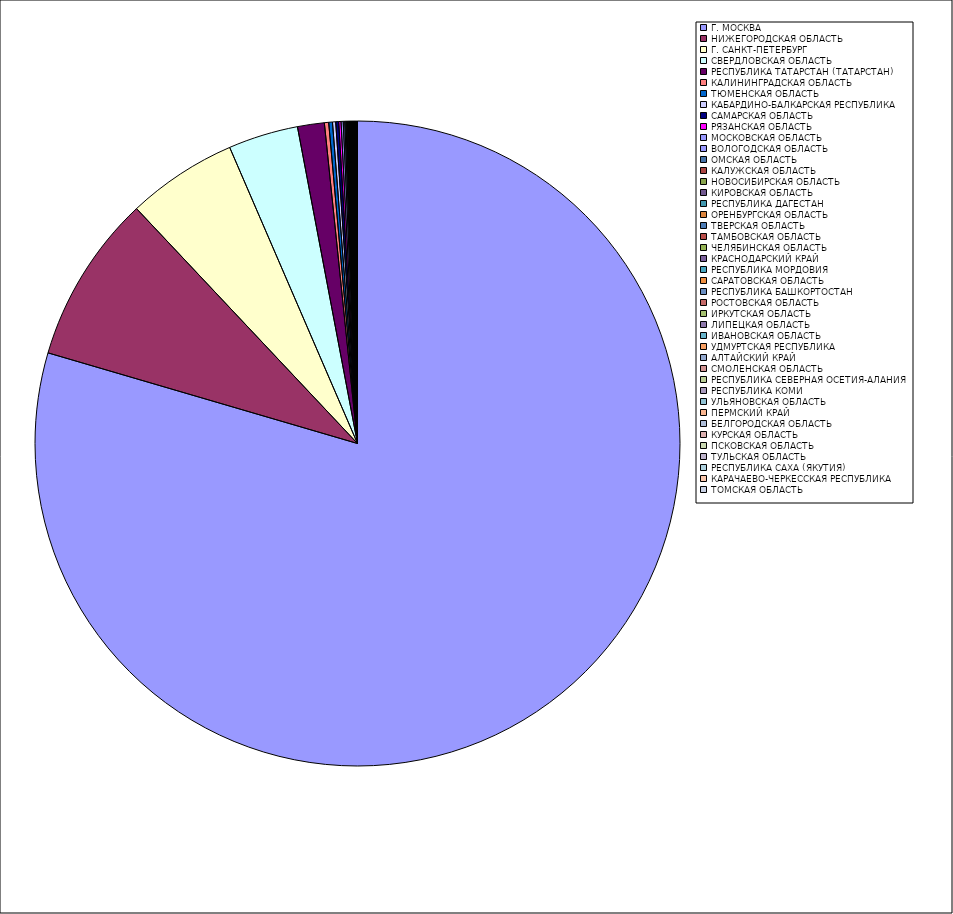
| Category | Оборот |
|---|---|
| Г. МОСКВА | 79.508 |
| НИЖЕГОРОДСКАЯ ОБЛАСТЬ | 8.45 |
| Г. САНКТ-ПЕТЕРБУРГ | 5.526 |
| СВЕРДЛОВСКАЯ ОБЛАСТЬ | 3.501 |
| РЕСПУБЛИКА ТАТАРСТАН (ТАТАРСТАН) | 1.343 |
| КАЛИНИНГРАДСКАЯ ОБЛАСТЬ | 0.214 |
| ТЮМЕНСКАЯ ОБЛАСТЬ | 0.188 |
| КАБАРДИНО-БАЛКАРСКАЯ РЕСПУБЛИКА | 0.16 |
| САМАРСКАЯ ОБЛАСТЬ | 0.148 |
| РЯЗАНСКАЯ ОБЛАСТЬ | 0.116 |
| МОСКОВСКАЯ ОБЛАСТЬ | 0.108 |
| ВОЛОГОДСКАЯ ОБЛАСТЬ | 0.074 |
| ОМСКАЯ ОБЛАСТЬ | 0.056 |
| КАЛУЖСКАЯ ОБЛАСТЬ | 0.042 |
| НОВОСИБИРСКАЯ ОБЛАСТЬ | 0.037 |
| КИРОВСКАЯ ОБЛАСТЬ | 0.037 |
| РЕСПУБЛИКА ДАГЕСТАН | 0.034 |
| ОРЕНБУРГСКАЯ ОБЛАСТЬ | 0.029 |
| ТВЕРСКАЯ ОБЛАСТЬ | 0.029 |
| ТАМБОВСКАЯ ОБЛАСТЬ | 0.029 |
| ЧЕЛЯБИНСКАЯ ОБЛАСТЬ | 0.028 |
| КРАСНОДАРСКИЙ КРАЙ | 0.027 |
| РЕСПУБЛИКА МОРДОВИЯ | 0.026 |
| САРАТОВСКАЯ ОБЛАСТЬ | 0.023 |
| РЕСПУБЛИКА БАШКОРТОСТАН | 0.021 |
| РОСТОВСКАЯ ОБЛАСТЬ | 0.02 |
| ИРКУТСКАЯ ОБЛАСТЬ | 0.02 |
| ЛИПЕЦКАЯ ОБЛАСТЬ | 0.017 |
| ИВАНОВСКАЯ ОБЛАСТЬ | 0.017 |
| УДМУРТСКАЯ РЕСПУБЛИКА | 0.016 |
| АЛТАЙСКИЙ КРАЙ | 0.014 |
| СМОЛЕНСКАЯ ОБЛАСТЬ | 0.014 |
| РЕСПУБЛИКА СЕВЕРНАЯ ОСЕТИЯ-АЛАНИЯ | 0.014 |
| РЕСПУБЛИКА КОМИ | 0.011 |
| УЛЬЯНОВСКАЯ ОБЛАСТЬ | 0.01 |
| ПЕРМСКИЙ КРАЙ | 0.01 |
| БЕЛГОРОДСКАЯ ОБЛАСТЬ | 0.009 |
| КУРСКАЯ ОБЛАСТЬ | 0.009 |
| ПСКОВСКАЯ ОБЛАСТЬ | 0.009 |
| ТУЛЬСКАЯ ОБЛАСТЬ | 0.007 |
| РЕСПУБЛИКА САХА (ЯКУТИЯ) | 0.005 |
| КАРАЧАЕВО-ЧЕРКЕССКАЯ РЕСПУБЛИКА | 0.005 |
| ТОМСКАЯ ОБЛАСТЬ | 0.005 |